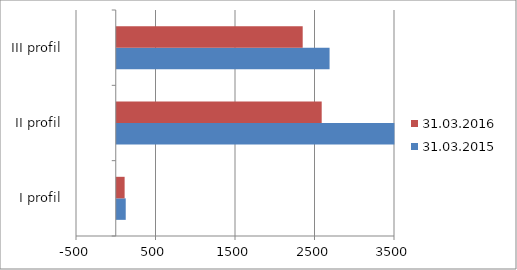
| Category | 31.03.2015 | 31.03.2016 |
|---|---|---|
| I profil | 113 | 99 |
| II profil | 3492 | 2578 |
| III profil | 2677 | 2339 |